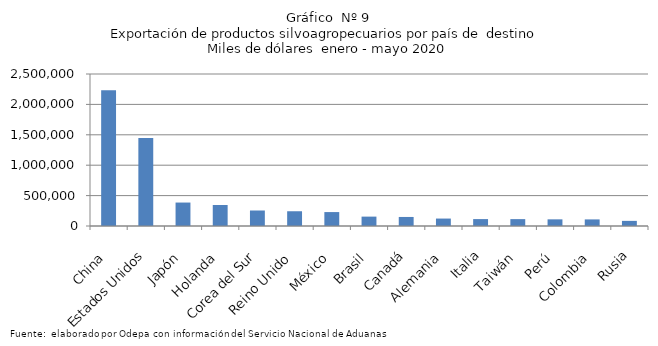
| Category | Series 0 |
|---|---|
| China | 2232018.497 |
| Estados Unidos | 1446570.426 |
| Japón | 385715.31 |
| Holanda | 345894.109 |
| Corea del Sur | 254953.251 |
| Reino Unido | 242590.209 |
| México | 229092.875 |
| Brasil | 154311.326 |
| Canadá | 148645.837 |
| Alemania | 122403.145 |
| Italia | 113686.771 |
| Taiwán | 113138.263 |
| Perú | 109516.939 |
| Colombia | 108466.121 |
| Rusia | 84200.986 |